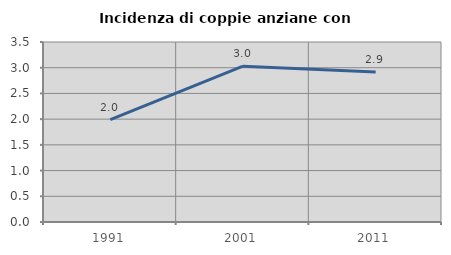
| Category | Incidenza di coppie anziane con figli |
|---|---|
| 1991.0 | 1.991 |
| 2001.0 | 3.03 |
| 2011.0 | 2.915 |